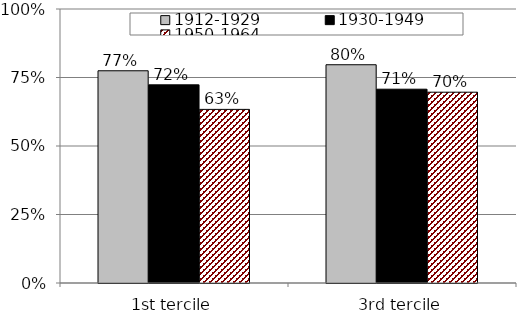
| Category | 1912-1929 | 1930-1949 | 1950-1964 |
|---|---|---|---|
| 1st tercile | 0.775 | 0.723 | 0.634 |
| 3rd tercile | 0.797 | 0.707 | 0.696 |